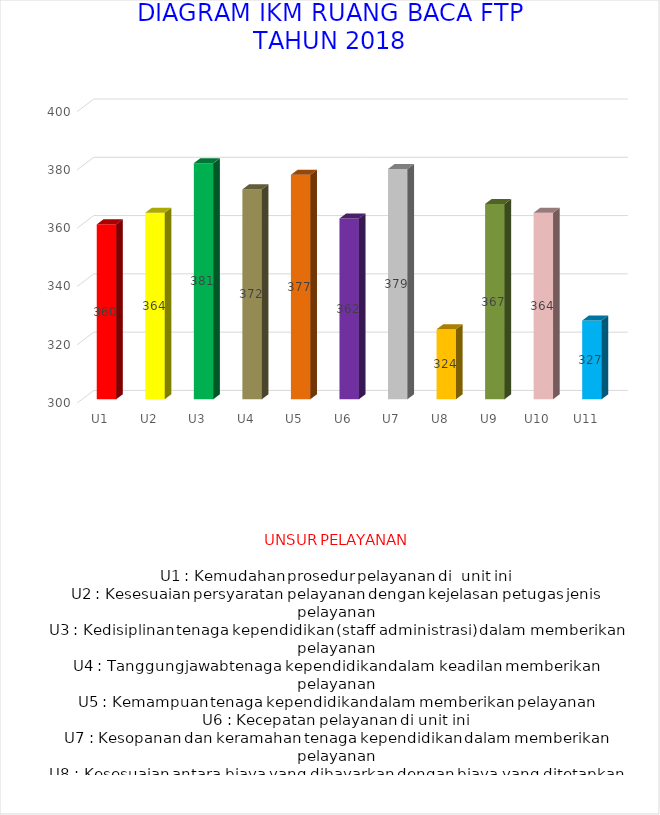
| Category | Series 0 | Series 1 | Series 2 | Series 3 | Series 4 | Series 5 |
|---|---|---|---|---|---|---|
| U1 | 360 |  |  |  |  |  |
| U2 | 364 |  |  |  |  |  |
| U3 | 381 |  |  |  |  |  |
| U4 | 372 |  |  |  |  |  |
| U5 | 377 |  |  |  |  |  |
| U6 | 362 |  |  |  |  |  |
| U7 | 379 |  |  |  |  |  |
| U8 | 324 |  |  |  |  |  |
| U9 | 367 |  |  |  |  |  |
| U10 | 364 |  |  |  |  |  |
| U11 | 327 |  |  |  |  |  |